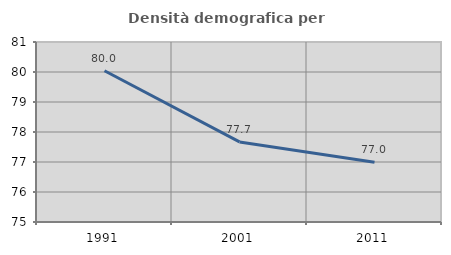
| Category | Densità demografica |
|---|---|
| 1991.0 | 80.042 |
| 2001.0 | 77.67 |
| 2011.0 | 76.99 |